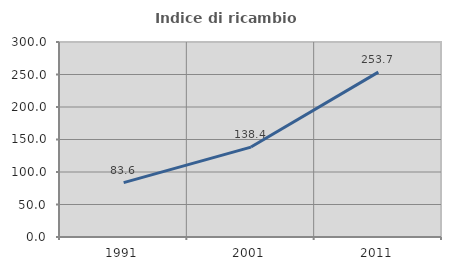
| Category | Indice di ricambio occupazionale  |
|---|---|
| 1991.0 | 83.624 |
| 2001.0 | 138.351 |
| 2011.0 | 253.696 |